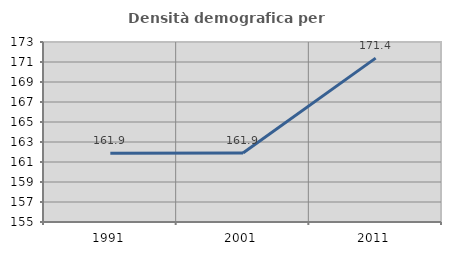
| Category | Densità demografica |
|---|---|
| 1991.0 | 161.87 |
| 2001.0 | 161.892 |
| 2011.0 | 171.389 |